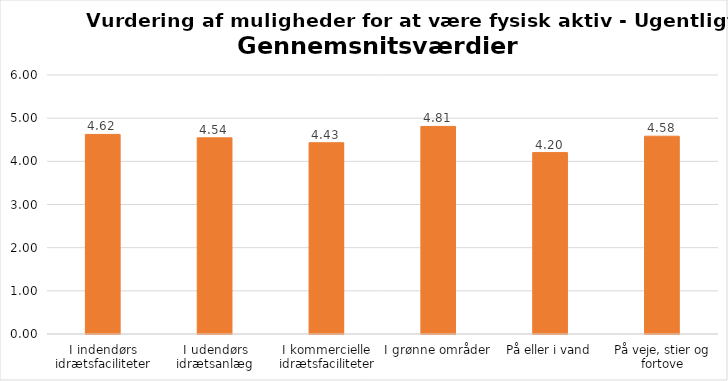
| Category | Gennemsnit |
|---|---|
| I indendørs idrætsfaciliteter | 4.624 |
| I udendørs idrætsanlæg | 4.544 |
| I kommercielle idrætsfaciliteter | 4.431 |
| I grønne områder | 4.809 |
| På eller i vand | 4.202 |
| På veje, stier og fortove | 4.582 |